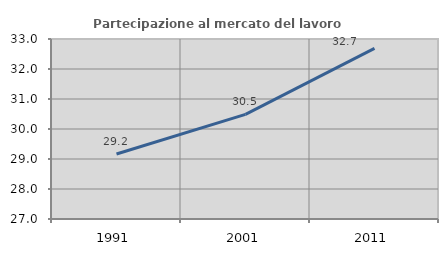
| Category | Partecipazione al mercato del lavoro  femminile |
|---|---|
| 1991.0 | 29.167 |
| 2001.0 | 30.488 |
| 2011.0 | 32.686 |